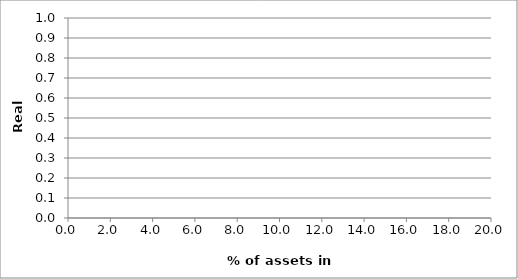
| Category | Series 0 |
|---|---|
| 0.0 | 0 |
| 0.0 | 0 |
| 0.0 | 0 |
| 0.0 | 0 |
| 0.0 | 0 |
| 0.0 | 0 |
| 0.0 | 0 |
| 0.0 | 0 |
| 0.0 | 0 |
| 0.0 | 0 |
| 0.0 | 0 |
| 0.0 | 0 |
| 0.0 | 0 |
| 0.0 | 0 |
| 0.0 | 0 |
| 0.0 | 0 |
| 0.0 | 0 |
| 0.0 | 0 |
| 0.0 | 0 |
| 0.0 | 0 |
| 0.0 | 0 |
| 0.0 | 0 |
| 0.0 | 0 |
| 0.0 | 0 |
| 0.0 | 0 |
| 0.0 | 0 |
| 0.0 | 0 |
| 0.0 | 0 |
| 0.0 | 0 |
| 0.0 | 0 |
| 0.0 | 0 |
| 0.0 | 0 |
| 0.0 | 0 |
| 0.0 | 0 |
| 0.0 | 0 |
| 0.0 | 0 |
| 0.0 | 0 |
| 0.0 | 0 |
| 0.0 | 0 |
| 0.0 | 0 |
| 0.0 | 0 |
| 0.0 | 0 |
| 0.0 | 0 |
| 0.0 | 0 |
| 0.0 | 0 |
| 0.0 | 0 |